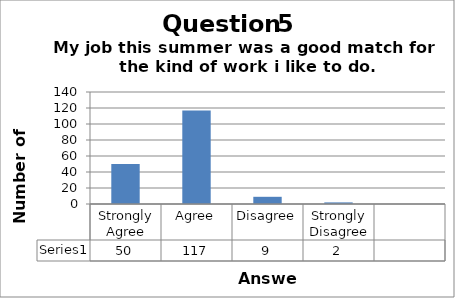
| Category | Series 0 |
|---|---|
| Strongly Agree | 50 |
| Agree | 117 |
| Disagree | 9 |
| Strongly Disagree | 2 |